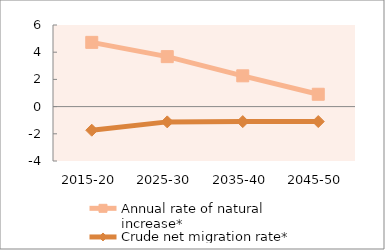
| Category | Annual rate of natural increase* | Crude net migration rate* |
|---|---|---|
| 2015-20 | 4.723 | -1.736 |
| 2025-30 | 3.674 | -1.124 |
| 2035-40 | 2.263 | -1.103 |
| 2045-50 | 0.907 | -1.098 |